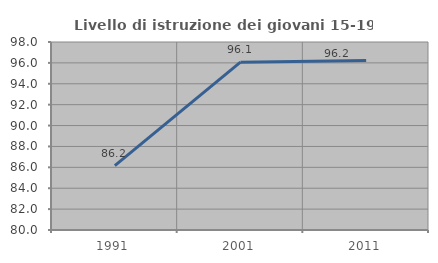
| Category | Livello di istruzione dei giovani 15-19 anni |
|---|---|
| 1991.0 | 86.167 |
| 2001.0 | 96.071 |
| 2011.0 | 96.237 |